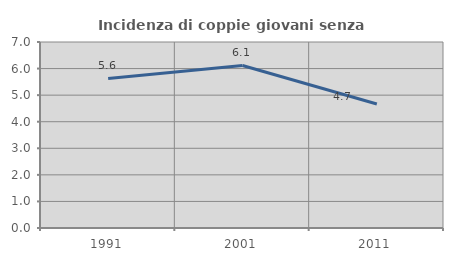
| Category | Incidenza di coppie giovani senza figli |
|---|---|
| 1991.0 | 5.628 |
| 2001.0 | 6.118 |
| 2011.0 | 4.667 |